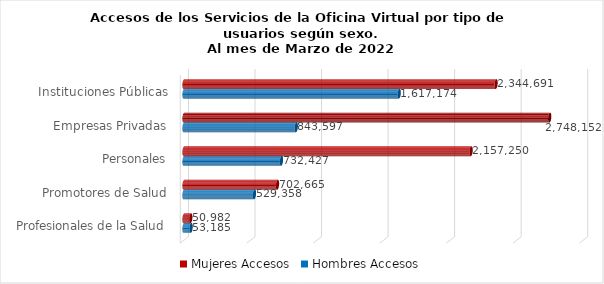
| Category | Mujeres | Hombres |
|---|---|---|
| Instituciones Públicas | 2344691 | 1617174 |
| Empresas Privadas | 2748152 | 843597 |
| Personales | 2157250 | 732427 |
| Promotores de Salud | 702665 | 529358 |
| Profesionales de la Salud | 50982 | 53185 |